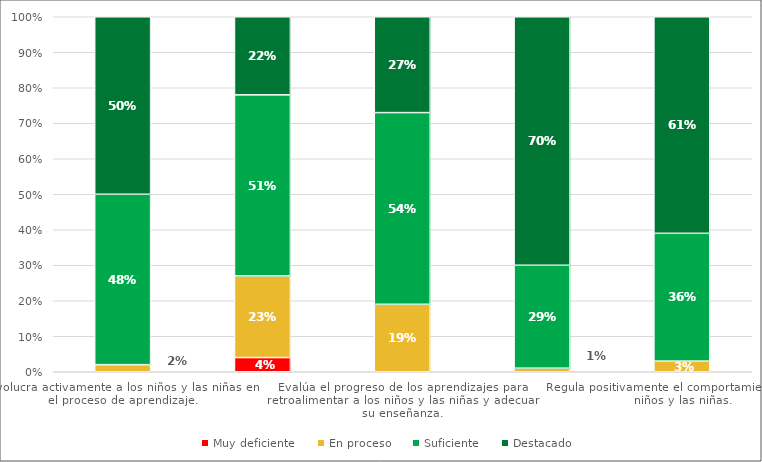
| Category | Muy deficiente | En proceso | Suficiente | Destacado |
|---|---|---|---|---|
| Involucra activamente a los niños y las niñas en el proceso de aprendizaje. | 0 | 0.02 | 0.48 | 0.5 |
| Promueve el razonamiento, la creatividad y/o el pensamiento crítico. | 0.04 | 0.23 | 0.51 | 0.22 |
| Evalúa el progreso de los aprendizajes para retroalimentar a los niños y las niñas y adecuar su enseñanza. | 0 | 0.19 | 0.54 | 0.27 |
| Propicia un ambiente de respeto y proximidad. | 0 | 0.01 | 0.29 | 0.7 |
| Regula positivamente el comportamiento de los niños y las niñas. | 0 | 0.03 | 0.36 | 0.61 |